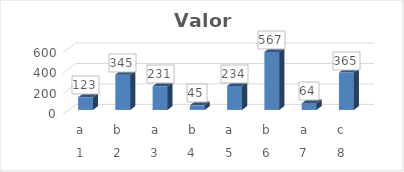
| Category | Valor |
|---|---|
| 0 | 123 |
| 1 | 345 |
| 2 | 231 |
| 3 | 45 |
| 4 | 234 |
| 5 | 567 |
| 6 | 64 |
| 7 | 365 |